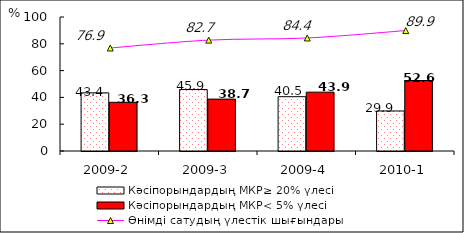
| Category | Кәсіпорындардың МКР≥ 20% үлесі | Кәсіпорындардың МКР< 5% үлесі |
|---|---|---|
| 2009-2 | 43.392 | 36.344 |
| 2009-3 | 45.858 | 38.729 |
| 2009-4 | 40.531 | 43.92 |
| 2010-1 | 29.852 | 52.593 |